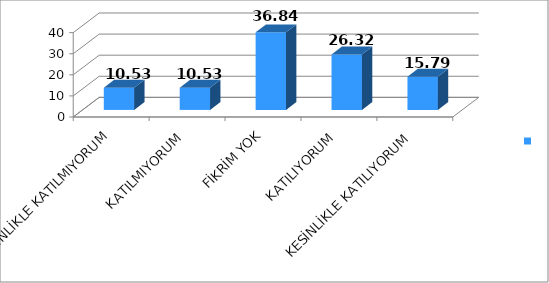
| Category | Series 0 |
|---|---|
| KESİNLİKLE KATILMIYORUM | 10.53 |
| KATILMIYORUM | 10.53 |
| FİKRİM YOK | 36.84 |
| KATILIYORUM | 26.32 |
| KESİNLİKLE KATILIYORUM | 15.79 |